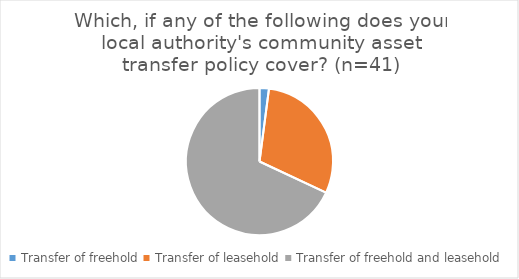
| Category | Series 0 |
|---|---|
| Transfer of freehold | 0.02 |
| Transfer of leasehold | 0.29 |
| Transfer of freehold and leasehold | 0.66 |